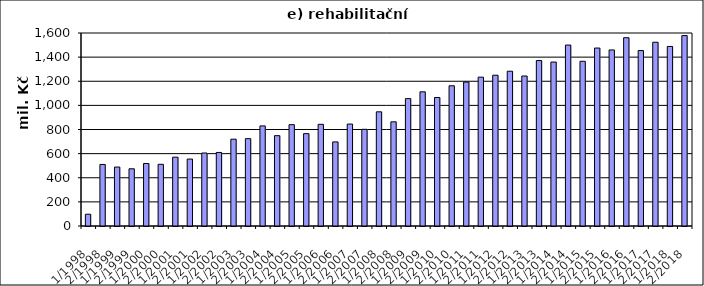
| Category | Series 0 |
|---|---|
| 1/1998 | 97696.227 |
| 2/1998 | 510340.866 |
| 1/1999 | 488695.462 |
| 2/1999 | 474301.538 |
| 1/2000 | 518050.834 |
| 2/2000 | 511337.266 |
| 1/2001 | 570678 |
| 2/2001 | 554851.096 |
| 1/2002 | 605127 |
| 2/2002 | 609602 |
| 1/2003 | 719792 |
| 2/2003 | 724162.836 |
| 1/2004 | 829675.254 |
| 2/2004 | 748844.166 |
| 1/2005 | 840110 |
| 2/2005 | 765643.394 |
| 1/2006 | 842869 |
| 2/2006 | 697042.1 |
| 1/2007 | 845102 |
| 2/2007 | 801680 |
| 1/2008 | 946614.448 |
| 2/2008 | 863649.552 |
| 1/2009 | 1056025 |
| 2/2009 | 1112313 |
| 1/2010 | 1065517 |
| 2/2010 | 1162412 |
| 1/2011 | 1193433 |
| 2/2011 | 1233944 |
| 1/2012 | 1250071 |
| 2/2012 | 1283050 |
| 1/2013 | 1243471 |
| 2/2013 | 1371672 |
| 1/2014 | 1359173 |
| 2/2014 | 1500026 |
| 1/2015 | 1365622 |
| 2/2015 | 1475316 |
| 1/2016 | 1459460 |
| 2/2016 | 1560950 |
| 1/2017 | 1454572 |
| 2/2017 | 1523517 |
| 1/2018 | 1488532.384 |
| 2/2018 | 1578530.193 |